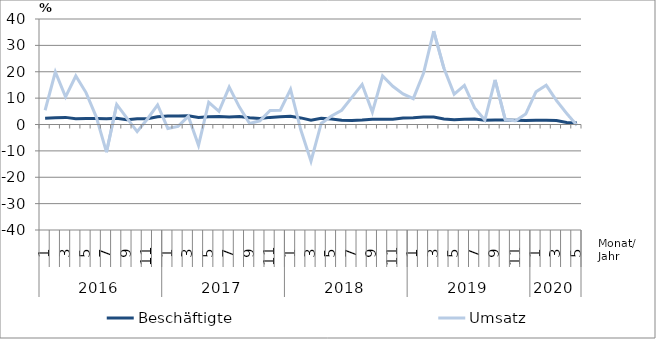
| Category | Beschäftigte | Umsatz |
|---|---|---|
| 0 | 2.4 | 5.4 |
| 1 | 2.6 | 19.9 |
| 2 | 2.7 | 10.5 |
| 3 | 2.2 | 18.4 |
| 4 | 2.3 | 12.1 |
| 5 | 2.3 | 2.9 |
| 6 | 2.2 | -10.5 |
| 7 | 2.4 | 7.6 |
| 8 | 1.8 | 2.4 |
| 9 | 2.2 | -2.7 |
| 10 | 2.2 | 2.1 |
| 11 | 2.9 | 7.4 |
| 12 | 3.2 | -1.5 |
| 13 | 3.2 | -0.7 |
| 14 | 3.3 | 3.1 |
| 15 | 2.7 | -7.9 |
| 16 | 2.9 | 8.4 |
| 17 | 3 | 5 |
| 18 | 2.8 | 14.2 |
| 19 | 3 | 6.6 |
| 20 | 2.6 | 0.4 |
| 21 | 2.3 | 1.4 |
| 22 | 2.7 | 5.3 |
| 23 | 2.9 | 5.4 |
| 24 | 3.1 | 13.3 |
| 25 | 2.5 | -2 |
| 26 | 1.6 | -13.9 |
| 27 | 2.4 | 0.4 |
| 28 | 2.1 | 3.2 |
| 29 | 1.6 | 5.4 |
| 30 | 1.5 | 10.3 |
| 31 | 1.7 | 15.2 |
| 32 | 2 | 4.7 |
| 33 | 2 | 18.4 |
| 34 | 2 | 14.5 |
| 35 | 2.5 | 11.6 |
| 36 | 2.6 | 9.8 |
| 37 | 2.8 | 19.4 |
| 38 | 2.8 | 35.4 |
| 39 | 2.1 | 21.3 |
| 40 | 1.8 | 11.5 |
| 41 | 2 | 14.8 |
| 42 | 2.1 | 6.3 |
| 43 | 1.6 | 1.7 |
| 44 | 1.7 | 16.9 |
| 45 | 1.7 | 1.8 |
| 46 | 1.6 | 1.4 |
| 47 | 1.5 | 4 |
| 48 | 1.6 | 12.4 |
| 49 | 1.6 | 14.9 |
| 50 | 1.5 | 9.1 |
| 51 | 0.8 | 4.2 |
| 52 | 0.6 | -0.3 |